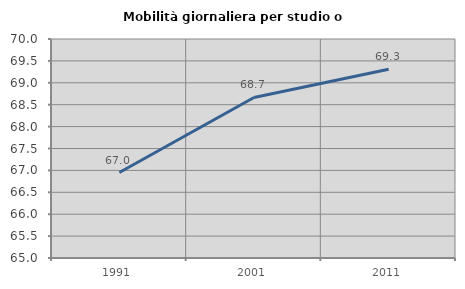
| Category | Mobilità giornaliera per studio o lavoro |
|---|---|
| 1991.0 | 66.952 |
| 2001.0 | 68.666 |
| 2011.0 | 69.307 |